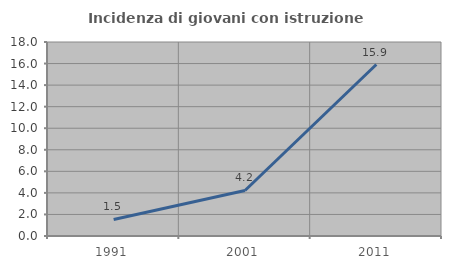
| Category | Incidenza di giovani con istruzione universitaria |
|---|---|
| 1991.0 | 1.538 |
| 2001.0 | 4.225 |
| 2011.0 | 15.909 |